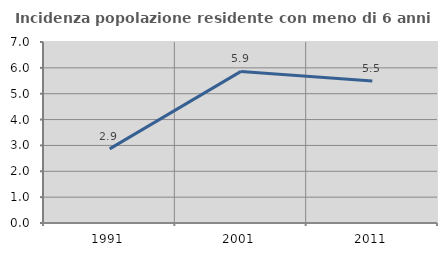
| Category | Incidenza popolazione residente con meno di 6 anni |
|---|---|
| 1991.0 | 2.865 |
| 2001.0 | 5.863 |
| 2011.0 | 5.496 |